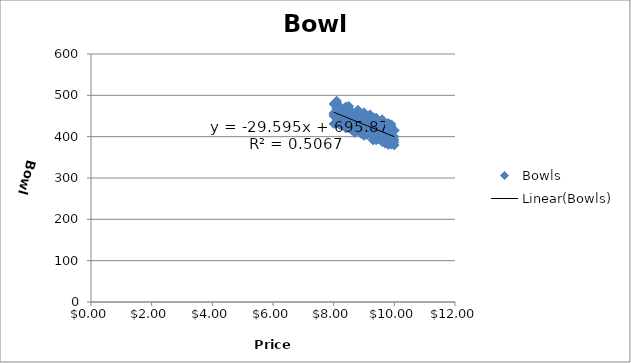
| Category | Bowls |
|---|---|
| 9.3 | 391 |
| 9.1 | 418 |
| 8.5 | 459 |
| 9.5 | 424 |
| 8.7 | 447 |
| 9.7 | 383 |
| 9.8 | 399 |
| 8.8 | 440 |
| 8.6 | 436 |
| 9.6 | 413 |
| 8.2 | 428 |
| 8.0 | 479 |
| 8.1 | 462 |
| 9.8 | 387 |
| 8.9 | 454 |
| 9.4 | 418 |
| 8.3 | 447 |
| 9.6 | 442 |
| 9.9 | 381 |
| 9.3 | 401 |
| 8.1 | 468 |
| 8.7 | 428 |
| 8.1 | 480 |
| 8.1 | 436 |
| 8.5 | 474 |
| 8.1 | 487 |
| 8.8 | 459 |
| 9.5 | 421 |
| 9.5 | 401 |
| 8.9 | 420 |
| 8.1 | 435 |
| 8.8 | 458 |
| 10.0 | 379 |
| 9.4 | 426 |
| 8.2 | 443 |
| 8.1 | 483 |
| 8.7 | 409 |
| 9.7 | 406 |
| 8.0 | 454 |
| 8.5 | 468 |
| 8.8 | 421 |
| 9.1 | 404 |
| 9.9 | 387 |
| 8.9 | 412 |
| 10.0 | 400 |
| 9.5 | 418 |
| 8.5 | 441 |
| 9.1 | 409 |
| 8.8 | 443 |
| 9.3 | 425 |
| 8.7 | 445 |
| 8.5 | 467 |
| 8.5 | 473 |
| 8.8 | 437 |
| 8.1 | 445 |
| 10.0 | 380 |
| 10.0 | 415 |
| 9.1 | 430 |
| 8.6 | 433 |
| 9.6 | 395 |
| 9.3 | 423 |
| 8.2 | 463 |
| 8.7 | 436 |
| 9.5 | 394 |
| 9.5 | 412 |
| 9.5 | 416 |
| 9.2 | 419 |
| 9.7 | 429 |
| 9.9 | 409 |
| 8.6 | 415 |
| 8.5 | 437 |
| 9.9 | 417 |
| 9.6 | 441 |
| 8.5 | 421 |
| 8.2 | 436 |
| 9.3 | 447 |
| 9.1 | 416 |
| 10.0 | 415 |
| 8.9 | 447 |
| 9.0 | 459 |
| 9.5 | 425 |
| 9.3 | 432 |
| 8.1 | 437 |
| 8.6 | 423 |
| 8.4 | 459 |
| 8.4 | 473 |
| 9.2 | 437 |
| 9.4 | 413 |
| 9.6 | 441 |
| 9.0 | 414 |
| 8.4 | 455 |
| 8.7 | 423 |
| 8.7 | 419 |
| 9.2 | 408 |
| 9.9 | 398 |
| 8.5 | 421 |
| 8.9 | 451 |
| 9.2 | 424 |
| 9.4 | 410 |
| 8.0 | 450 |
| 9.9 | 415 |
| 8.4 | 460 |
| 8.5 | 464 |
| 8.9 | 439 |
| 9.1 | 437 |
| 8.3 | 459 |
| 9.8 | 433 |
| 8.3 | 432 |
| 9.2 | 431 |
| 8.9 | 417 |
| 9.8 | 380 |
| 9.9 | 423 |
| 8.6 | 431 |
| 8.7 | 451 |
| 8.1 | 474 |
| 9.3 | 413 |
| 8.6 | 431 |
| 9.6 | 387 |
| 9.7 | 404 |
| 9.8 | 424 |
| 9.4 | 391 |
| 9.4 | 446 |
| 9.9 | 422 |
| 10.0 | 415 |
| 9.9 | 422 |
| 8.3 | 460 |
| 9.1 | 444 |
| 8.3 | 434 |
| 8.2 | 430 |
| 9.0 | 411 |
| 9.1 | 436 |
| 9.3 | 432 |
| 9.4 | 430 |
| 9.9 | 425 |
| 9.4 | 400 |
| 8.9 | 448 |
| 9.6 | 394 |
| 8.3 | 434 |
| 8.5 | 448 |
| 10.0 | 392 |
| 8.9 | 407 |
| 8.6 | 453 |
| 8.5 | 462 |
| 9.4 | 410 |
| 8.5 | 468 |
| 9.0 | 427 |
| 9.3 | 445 |
| 9.9 | 382 |
| 9.4 | 434 |
| 9.4 | 426 |
| 8.8 | 448 |
| 9.0 | 403 |
| 9.0 | 413 |
| 8.4 | 420 |
| 9.8 | 404 |
| 8.1 | 483 |
| 9.2 | 454 |
| 9.1 | 432 |
| 10.0 | 386 |
| 9.0 | 402 |
| 8.1 | 468 |
| 9.6 | 400 |
| 8.7 | 419 |
| 9.0 | 408 |
| 8.7 | 452 |
| 8.9 | 410 |
| 9.7 | 395 |
| 9.9 | 430 |
| 9.7 | 388 |
| 9.3 | 393 |
| 8.2 | 473 |
| 8.8 | 465 |
| 9.7 | 395 |
| 8.0 | 431 |
| 9.0 | 452 |
| 9.6 | 397 |
| 8.1 | 446 |
| 9.5 | 408 |
| 9.8 | 430 |
| 8.7 | 414 |
| 9.5 | 418 |
| 8.5 | 447 |
| 9.4 | 404 |
| 9.9 | 408 |
| 8.0 | 457 |
| 9.5 | 421 |